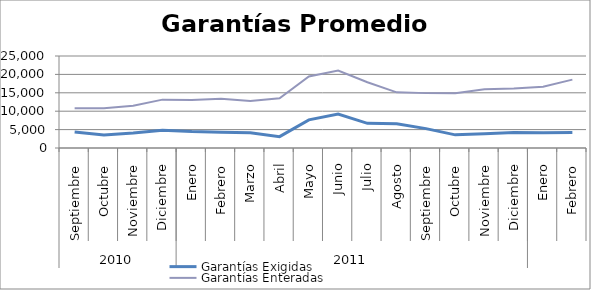
| Category | Garantías Exigidas | Garantías Enteradas |
|---|---|---|
| 0 | 4372.607 | 10829.062 |
| 1 | 3557.93 | 10787.9 |
| 2 | 4056.528 | 11463.422 |
| 3 | 4832.111 | 13142.881 |
| 4 | 4466.32 | 13061.162 |
| 5 | 4313.718 | 13357.444 |
| 6 | 4162.491 | 12796.251 |
| 7 | 3090.395 | 13495.263 |
| 8 | 7655.186 | 19416.342 |
| 9 | 9198.096 | 21035.301 |
| 10 | 6699.851 | 17866.843 |
| 11 | 6615.292 | 15119.839 |
| 12 | 5266.973 | 14911.639 |
| 13 | 3572.137 | 14861.465 |
| 14 | 3876.388 | 15976.819 |
| 15 | 4182.413 | 16147.351 |
| 16 | 4146.8 | 16662.483 |
| 17 | 4190.531 | 18572.749 |